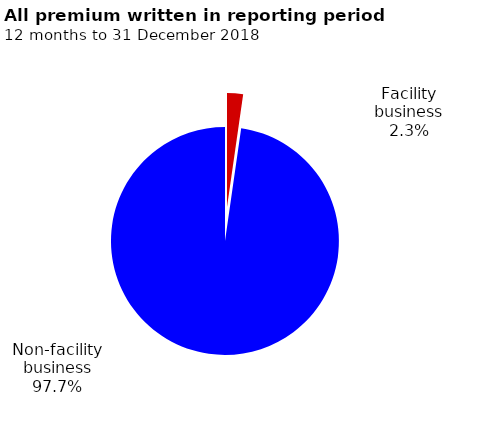
| Category | Series 0 |
|---|---|
| Facility business | 103016208 |
| Non-facility business | 4440311243 |